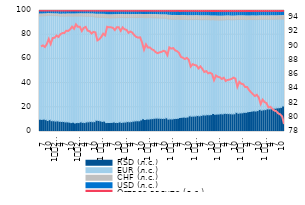
| Category | RSD (л.с.) | EUR (л.с.) | CHF (л.с.) | USD (л.с.) | Остале валуте (л.с.) |
|---|---|---|---|---|---|
| 7 | 10.115 | 85.37 | 1.61 | 2.46 | 0.446 |
| 8 | 9.978 | 85.529 | 1.604 | 2.438 | 0.452 |
| 9 | 10.198 | 85.428 | 1.58 | 2.357 | 0.438 |
| 10 | 9.798 | 85.869 | 1.566 | 2.324 | 0.444 |
| 11 | 9.072 | 86.943 | 1.452 | 2.142 | 0.39 |
| 12 | 9.77 | 86.189 | 1.43 | 2.229 | 0.383 |
| 1
2010. | 8.941 | 86.931 | 1.457 | 2.281 | 0.39 |
| 2 | 8.905 | 86.91 | 1.452 | 2.33 | 0.403 |
| 3 | 8.589 | 87.15 | 1.483 | 2.366 | 0.411 |
| 4 | 8.784 | 86.968 | 1.463 | 2.371 | 0.414 |
| 5 | 8.405 | 87.039 | 1.52 | 2.59 | 0.446 |
| 6 | 8.248 | 87.014 | 1.656 | 2.62 | 0.461 |
| 7 | 8.245 | 87.215 | 1.621 | 2.457 | 0.462 |
| 8 | 7.91 | 87.348 | 1.714 | 2.563 | 0.466 |
| 9 | 7.952 | 87.502 | 1.686 | 2.414 | 0.446 |
| 10 | 7.717 | 87.786 | 1.648 | 2.397 | 0.452 |
| 11 | 7.341 | 88.037 | 1.71 | 2.479 | 0.433 |
| 12 | 7.637 | 87.676 | 1.823 | 2.425 | 0.439 |
| 1
2011. | 7.016 | 88.346 | 1.817 | 2.386 | 0.434 |
| 2 | 7.37 | 87.996 | 1.823 | 2.371 | 0.44 |
| 3 | 7.354 | 88.074 | 1.805 | 2.324 | 0.443 |
| 4 | 7.945 | 87.579 | 1.807 | 2.221 | 0.447 |
| 5 | 7.515 | 87.803 | 1.911 | 2.315 | 0.454 |
| 6 | 7.377 | 87.927 | 1.938 | 2.308 | 0.45 |
| 7 | 7.904 | 87.283 | 2.056 | 2.295 | 0.462 |
| 8 | 7.98 | 87.307 | 1.991 | 2.247 | 0.475 |
| 9 | 8.301 | 86.921 | 1.94 | 2.369 | 0.469 |
| 10 | 8.073 | 87.169 | 1.977 | 2.309 | 0.473 |
| 11 | 8.146 | 86.605 | 2.259 | 2.48 | 0.509 |
| 12 | 9.27 | 85.174 | 2.419 | 2.595 | 0.541 |
| 1 
2012. | 9.109 | 85.301 | 2.458 | 2.583 | 0.55 |
| 2 | 8.794 | 85.59 | 2.493 | 2.564 | 0.558 |
| 3 | 8.333 | 85.981 | 2.527 | 2.594 | 0.565 |
| 4 | 8.562 | 85.696 | 2.544 | 2.621 | 0.575 |
| 5 | 7.362 | 86.627 | 2.577 | 2.844 | 0.59 |
| 6 | 7.433 | 86.525 | 2.599 | 2.848 | 0.595 |
| 7 | 7.433 | 86.42 | 2.609 | 2.917 | 0.62 |
| 8 | 7.505 | 86.376 | 2.615 | 2.885 | 0.62 |
| 9 | 7.823 | 86.159 | 2.592 | 2.797 | 0.629 |
| 10 | 7.416 | 86.573 | 2.606 | 2.792 | 0.612 |
| 11 | 7.427 | 86.67 | 2.57 | 2.735 | 0.598 |
| 12 | 7.927 | 86.21 | 2.556 | 2.701 | 0.606 |
| 1 
2013. | 7.449 | 86.785 | 2.51 | 2.665 | 0.59 |
| 2 | 7.71 | 86.423 | 2.529 | 2.74 | 0.597 |
| 3 | 7.792 | 86.267 | 2.535 | 2.785 | 0.621 |
| 4 | 8.206 | 85.943 | 2.497 | 2.729 | 0.624 |
| 5 | 8.023 | 86.137 | 2.473 | 2.742 | 0.624 |
| 6 | 8.179 | 85.957 | 2.486 | 2.762 | 0.616 |
| 7 | 8.54 | 85.621 | 2.505 | 2.713 | 0.622 |
| 8 | 8.775 | 85.363 | 2.517 | 2.722 | 0.624 |
| 9 | 8.887 | 85.251 | 2.554 | 2.676 | 0.632 |
| 10 | 8.838 | 85.372 | 2.537 | 2.638 | 0.615 |
| 11 | 9.576 | 84.624 | 2.545 | 2.646 | 0.608 |
| 12 | 10.569 | 83.679 | 2.539 | 2.611 | 0.603 |
| 1 
2014. | 9.827 | 84.271 | 2.605 | 2.685 | 0.612 |
| 2 | 10.277 | 83.795 | 2.621 | 2.689 | 0.618 |
| 3 | 10.26 | 83.834 | 2.623 | 2.661 | 0.622 |
| 4 | 10.521 | 83.572 | 2.633 | 2.65 | 0.623 |
| 5 | 10.642 | 83.374 | 2.643 | 2.688 | 0.653 |
| 6 | 10.919 | 83.096 | 2.653 | 2.668 | 0.665 |
| 7 | 11.072 | 82.869 | 2.679 | 2.711 | 0.669 |
| 8 | 10.953 | 82.919 | 2.703 | 2.753 | 0.672 |
| 9 | 10.875 | 82.872 | 2.725 | 2.856 | 0.673 |
| 10 | 10.735 | 83.017 | 2.719 | 2.852 | 0.678 |
| 11 | 10.805 | 82.879 | 2.753 | 2.866 | 0.694 |
| 12 | 11.337 | 82.303 | 2.772 | 2.932 | 0.656 |
| 1 
2015. | 10.257 | 82.71 | 3.135 | 3.235 | 0.663 |
| 2 | 10.423 | 82.502 | 3.087 | 3.287 | 0.7 |
| 3 | 10.346 | 82.303 | 3.202 | 3.443 | 0.707 |
| 4 | 10.673 | 82.034 | 3.22 | 3.35 | 0.724 |
| 5 | 10.788 | 81.817 | 3.28 | 3.385 | 0.73 |
| 6 | 11.029 | 81.657 | 3.27 | 3.324 | 0.72 |
| 7 | 11.598 | 80.971 | 3.29 | 3.407 | 0.734 |
| 8 | 11.71 | 80.94 | 3.258 | 3.351 | 0.741 |
| 9 | 11.894 | 80.754 | 3.244 | 3.37 | 0.737 |
| 10 | 11.724 | 80.814 | 3.258 | 3.452 | 0.752 |
| 11 | 11.994 | 80.422 | 3.253 | 3.57 | 0.76 |
| 12 | 12.946 | 79.566 | 3.26 | 3.491 | 0.737 |
| 1 
2016. | 12.619 | 79.895 | 3.208 | 3.543 | 0.735 |
| 2 | 12.719 | 79.748 | 3.252 | 3.539 | 0.742 |
| 3 | 12.799 | 79.741 | 3.245 | 3.442 | 0.773 |
| 4 | 13.207 | 79.344 | 3.216 | 3.449 | 0.785 |
| 5 | 12.923 | 79.558 | 3.186 | 3.524 | 0.808 |
| 6 | 13.272 | 79.143 | 3.232 | 3.553 | 0.799 |
| 7 | 13.713 | 78.712 | 3.235 | 3.545 | 0.794 |
| 8 | 13.58 | 78.872 | 3.203 | 3.549 | 0.797 |
| 9 | 13.902 | 78.516 | 3.241 | 3.552 | 0.788 |
| 10 | 13.813 | 78.564 | 3.221 | 3.625 | 0.778 |
| 11 | 13.986 | 78.253 | 3.227 | 3.719 | 0.814 |
| 12 | 14.861 | 77.404 | 3.205 | 3.725 | 0.806 |
| 1 
2017. | 14.206 | 77.975 | 3.26 | 3.727 | 0.832 |
| 2 | 14.392 | 77.72 | 3.259 | 3.79 | 0.84 |
| 3 | 14.452 | 77.608 | 3.275 | 3.818 | 0.847 |
| 4 | 14.689 | 77.417 | 3.241 | 3.785 | 0.867 |
| 5 | 14.517 | 77.619 | 3.245 | 3.749 | 0.87 |
| 6 | 14.964 | 77.277 | 3.222 | 3.663 | 0.875 |
| 7 | 14.831 | 77.619 | 3.104 | 3.582 | 0.864 |
| 8 | 14.776 | 77.735 | 3.083 | 3.562 | 0.843 |
| 9 | 14.686 | 77.666 | 3.098 | 3.691 | 0.86 |
| 10 | 14.503 | 77.814 | 3.066 | 3.742 | 0.874 |
| 11 | 14.644 | 77.729 | 3.047 | 3.704 | 0.876 |
| 12 | 15.786 | 76.708 | 3.018 | 3.62 | 0.868 |
| 1 
2018. | 15.099 | 77.465 | 3.08 | 3.485 | 0.871 |
| 2 | 15.361 | 77.181 | 3.069 | 3.524 | 0.865 |
| 3 | 15.419 | 77.202 | 3.006 | 3.506 | 0.867 |
| 4 | 15.804 | 76.842 | 2.943 | 3.548 | 0.863 |
| 5 | 15.801 | 76.617 | 3.044 | 3.664 | 0.873 |
| 6 | 16.235 | 76.272 | 3.003 | 3.636 | 0.854 |
| 7 | 16.547 | 75.996 | 2.996 | 3.603 | 0.858 |
| 8 | 16.818 | 75.706 | 3.037 | 3.585 | 0.853 |
| 9 | 17.083 | 75.447 | 3.008 | 3.606 | 0.857 |
| 10 | 16.913 | 75.555 | 2.982 | 3.696 | 0.855 |
| 11 | 17.293 | 75.242 | 2.981 | 3.643 | 0.841 |
| 12 | 18.205 | 74.467 | 2.956 | 3.564 | 0.809 |
| 1 
2019. | 17.599 | 75.154 | 2.904 | 3.535 | 0.808 |
| 2 | 17.937 | 74.817 | 2.89 | 3.54 | 0.816 |
| 3 | 18.087 | 74.605 | 2.908 | 3.592 | 0.807 |
| 4 | 18.691 | 74.079 | 2.833 | 3.598 | 0.798 |
| 5 | 18.6 | 74.117 | 2.906 | 3.586 | 0.79 |
| 6 | 18.901 | 73.88 | 2.917 | 3.51 | 0.792 |
| 7 | 19.13 | 73.637 | 2.892 | 3.552 | 0.789 |
| 8 | 19.212 | 73.52 | 2.911 | 3.565 | 0.791 |
| 9 | 19.519 | 73.234 | 2.911 | 3.558 | 0.779 |
| 10 | 19.653 | 73.233 | 2.864 | 3.467 | 0.782 |
| 11 | 19.933 | 72.991 | 2.847 | 3.449 | 0.78 |
| 12 | 21.017 | 72.021 | 2.85 | 3.422 | 0.771 |